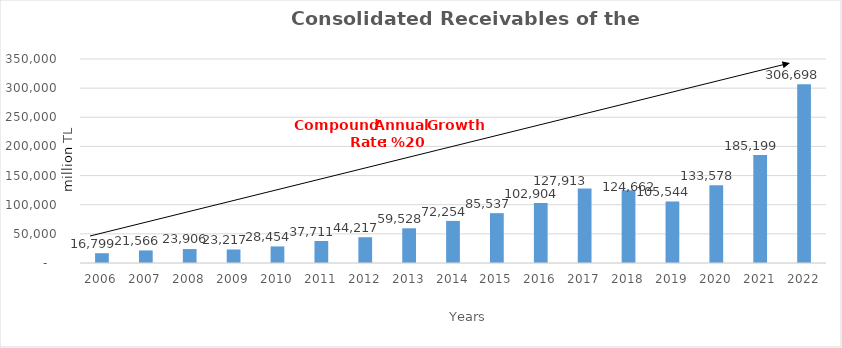
| Category | Total |
|---|---|
| 2006.0 | 16799.249 |
| 2007.0 | 21566.057 |
| 2008.0 | 23906.328 |
| 2009.0 | 23216.54 |
| 2010.0 | 28454.489 |
| 2011.0 | 37710.665 |
| 2012.0 | 44216.529 |
| 2013.0 | 59528.288 |
| 2014.0 | 72253.719 |
| 2015.0 | 85537 |
| 2016.0 | 102904 |
| 2017.0 | 127913 |
| 2018.0 | 124662 |
| 2019.0 | 105544 |
| 2020.0 | 133578 |
| 2021.0 | 185199 |
| 2022.0 | 306698 |